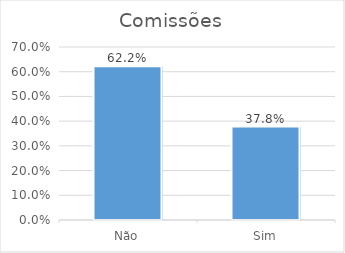
| Category | Contagem |
|---|---|
| Sim | 0.378 |
| Não | 0.622 |